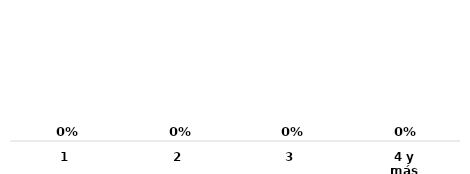
| Category | Series 0 |
|---|---|
| 1 | 0 |
| 2 | 0 |
| 3 | 0 |
| 4 y más | 0 |